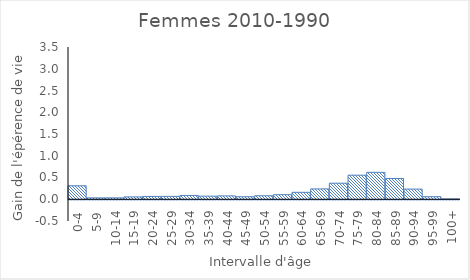
| Category | Femmes |
|---|---|
| 0-4 | 0.31 |
| 5-9 | 0.032 |
| 10-14 | 0.032 |
| 15-19 | 0.054 |
| 20-24 | 0.065 |
| 25-29 | 0.066 |
| 30-34 | 0.087 |
| 35-39 | 0.071 |
| 40-44 | 0.077 |
| 45-49 | 0.057 |
| 50-54 | 0.08 |
| 55-59 | 0.105 |
| 60-64 | 0.159 |
| 65-69 | 0.238 |
| 70-74 | 0.369 |
| 75-79 | 0.553 |
| 80-84 | 0.619 |
| 85-89 | 0.478 |
| 90-94 | 0.233 |
| 95-99 | 0.059 |
| 100+ | 0.006 |